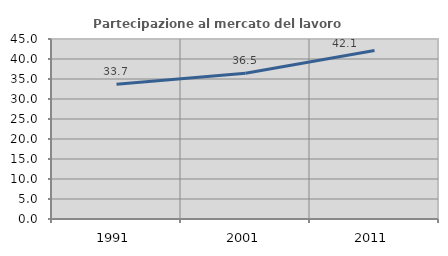
| Category | Partecipazione al mercato del lavoro  femminile |
|---|---|
| 1991.0 | 33.7 |
| 2001.0 | 36.461 |
| 2011.0 | 42.105 |